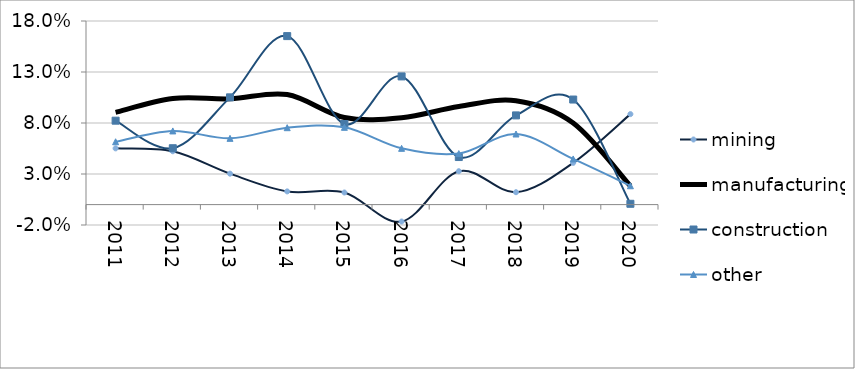
| Category | mining | manufacturing | construction | other |
|---|---|---|---|---|
| 2011.0 | 0.055 | 0.09 | 0.082 | 0.062 |
| 2012.0 | 0.052 | 0.104 | 0.055 | 0.072 |
| 2013.0 | 0.03 | 0.104 | 0.105 | 0.065 |
| 2014.0 | 0.013 | 0.108 | 0.165 | 0.075 |
| 2015.0 | 0.012 | 0.085 | 0.079 | 0.076 |
| 2016.0 | -0.017 | 0.085 | 0.126 | 0.055 |
| 2017.0 | 0.033 | 0.096 | 0.047 | 0.05 |
| 2018.0 | 0.012 | 0.102 | 0.087 | 0.069 |
| 2019.0 | 0.041 | 0.08 | 0.103 | 0.045 |
| 2020.0 | 0.089 | 0.018 | 0.001 | 0.018 |